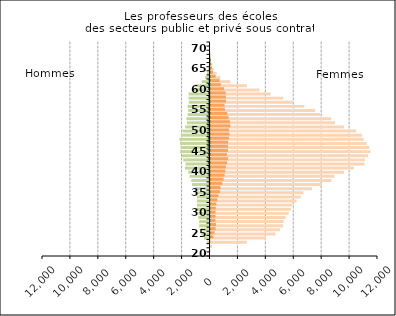
| Category | Femmes public | Femmes privé |
|---|---|---|
| 20.0 | 0 | 0 |
| 21.0 | 5 | 0 |
| 22.0 | 107 | 0 |
| 23.0 | 2606 | 9 |
| 24.0 | 3977 | 213 |
| 25.0 | 4653 | 287 |
| 26.0 | 4987 | 368 |
| 27.0 | 5206 | 395 |
| 28.0 | 5236 | 357 |
| 29.0 | 5385 | 362 |
| 30.0 | 5608 | 370 |
| 31.0 | 5754 | 380 |
| 32.0 | 5849 | 417 |
| 33.0 | 6155 | 490 |
| 34.0 | 6464 | 569 |
| 35.0 | 6658 | 689 |
| 36.0 | 7272 | 717 |
| 37.0 | 7966 | 836 |
| 38.0 | 8666 | 935 |
| 39.0 | 8897 | 1009 |
| 40.0 | 9567 | 1062 |
| 41.0 | 10275 | 1101 |
| 42.0 | 11033 | 1188 |
| 43.0 | 11058 | 1262 |
| 44.0 | 11297 | 1176 |
| 45.0 | 11467 | 1255 |
| 46.0 | 11381 | 1247 |
| 47.0 | 11194 | 1255 |
| 48.0 | 10970 | 1332 |
| 49.0 | 10846 | 1358 |
| 50.0 | 10433 | 1322 |
| 51.0 | 9564 | 1429 |
| 52.0 | 8923 | 1387 |
| 53.0 | 8662 | 1301 |
| 54.0 | 7853 | 1207 |
| 55.0 | 7510 | 1031 |
| 56.0 | 6725 | 1009 |
| 57.0 | 5886 | 1109 |
| 58.0 | 5202 | 1097 |
| 59.0 | 4306 | 1091 |
| 60.0 | 3509 | 962 |
| 61.0 | 2611 | 742 |
| 62.0 | 1409 | 649 |
| 63.0 | 709 | 359 |
| 64.0 | 436 | 188 |
| 65.0 | 240 | 109 |
| 66.0 | 125 | 61 |
| 67.0 | 37 | 28 |
| 68.0 | 10 | 7 |
| 69.0 | 3 | 0 |
| 70.0 | 0 | 0 |